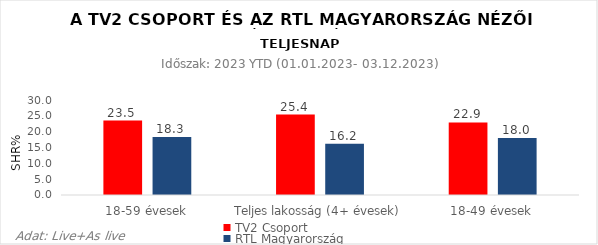
| Category | TV2 Csoport | RTL Magyarország |
|---|---|---|
| 18-59 évesek | 23.5 | 18.3 |
| Teljes lakosság (4+ évesek) | 25.4 | 16.2 |
| 18-49 évesek | 22.9 | 18 |